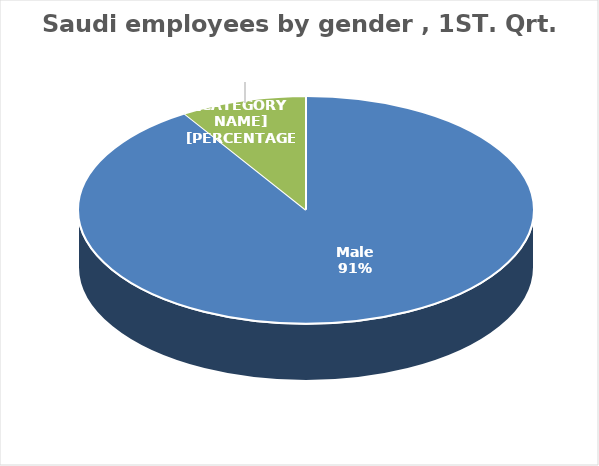
| Category | Series 0 |
|---|---|
| Male | 1586037 |
| Female | 155996 |